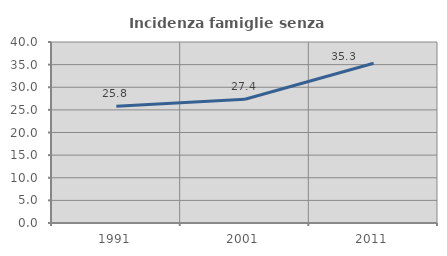
| Category | Incidenza famiglie senza nuclei |
|---|---|
| 1991.0 | 25.816 |
| 2001.0 | 27.36 |
| 2011.0 | 35.314 |